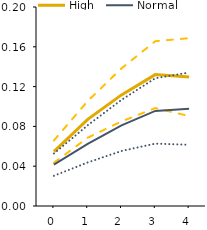
| Category | High | Series 4 | Series 5 | Normal | Series 1 | Series 2 |
|---|---|---|---|---|---|---|
| 0.0 | 0.055 | 0.066 | 0.043 | 0.042 | 0.053 | 0.03 |
| 1.0 | 0.087 | 0.105 | 0.069 | 0.062 | 0.081 | 0.044 |
| 2.0 | 0.112 | 0.138 | 0.085 | 0.081 | 0.107 | 0.055 |
| 3.0 | 0.132 | 0.166 | 0.098 | 0.096 | 0.128 | 0.063 |
| 4.0 | 0.13 | 0.169 | 0.09 | 0.098 | 0.134 | 0.062 |